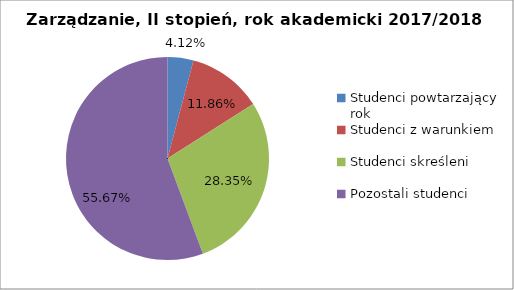
| Category | Series 0 |
|---|---|
| Studenci powtarzający rok | 8 |
| Studenci z warunkiem | 23 |
| Studenci skreśleni | 55 |
| Pozostali studenci | 108 |